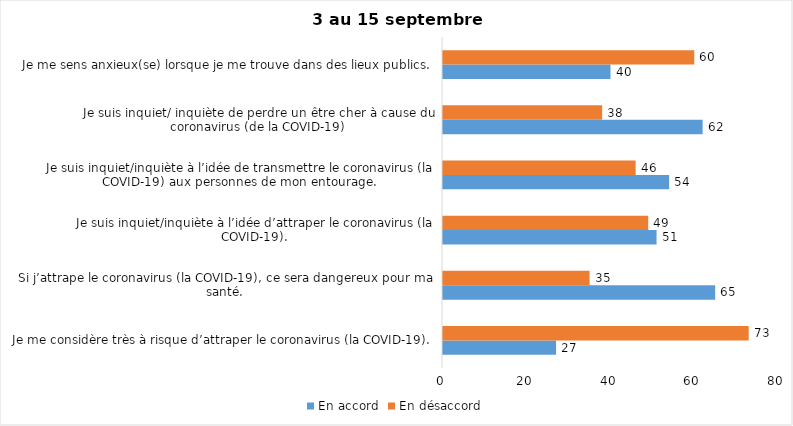
| Category | En accord | En désaccord |
|---|---|---|
| Je me considère très à risque d’attraper le coronavirus (la COVID-19). | 27 | 73 |
| Si j’attrape le coronavirus (la COVID-19), ce sera dangereux pour ma santé. | 65 | 35 |
| Je suis inquiet/inquiète à l’idée d’attraper le coronavirus (la COVID-19). | 51 | 49 |
| Je suis inquiet/inquiète à l’idée de transmettre le coronavirus (la COVID-19) aux personnes de mon entourage. | 54 | 46 |
| Je suis inquiet/ inquiète de perdre un être cher à cause du coronavirus (de la COVID-19) | 62 | 38 |
| Je me sens anxieux(se) lorsque je me trouve dans des lieux publics. | 40 | 60 |